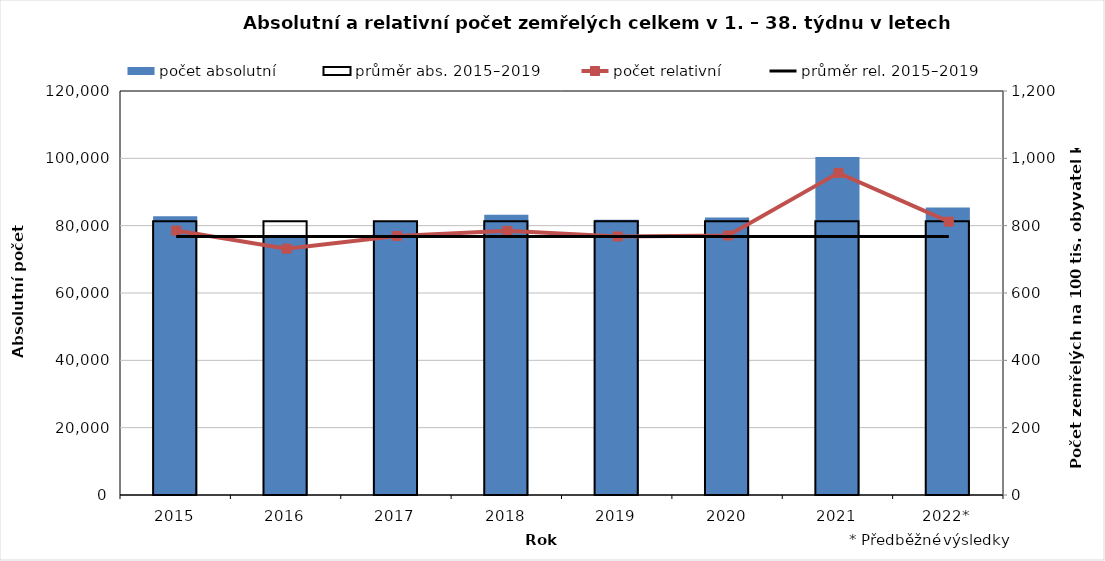
| Category | počet absolutní | průměr abs. 2015–2019 |
|---|---|---|
| 2015 | 82765 | 81291.4 |
| 2016 | 77231 | 81291.4 |
| 2017 | 81415 | 81291.4 |
| 2018 | 83262 | 81291.4 |
| 2019 | 81784 | 81291.4 |
| 2020 | 82432 | 81291.4 |
| 2021 | 100414 | 81291.4 |
| 2022* | 85394 | 81291.4 |